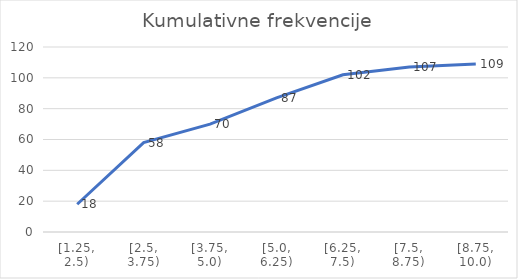
| Category | Series 0 |
|---|---|
| [1.25, 2.5) | 18 |
| [2.5, 3.75) | 58 |
| [3.75, 5.0) | 70 |
| [5.0, 6.25) | 87 |
| [6.25, 7.5) | 102 |
| [7.5, 8.75) | 107 |
| [8.75, 10.0) | 109 |